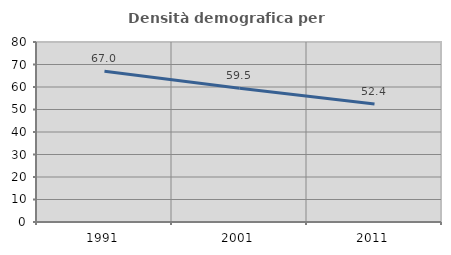
| Category | Densità demografica |
|---|---|
| 1991.0 | 66.966 |
| 2001.0 | 59.466 |
| 2011.0 | 52.431 |